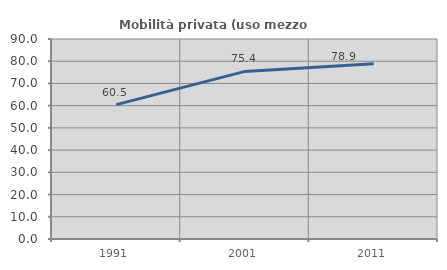
| Category | Mobilità privata (uso mezzo privato) |
|---|---|
| 1991.0 | 60.454 |
| 2001.0 | 75.425 |
| 2011.0 | 78.88 |